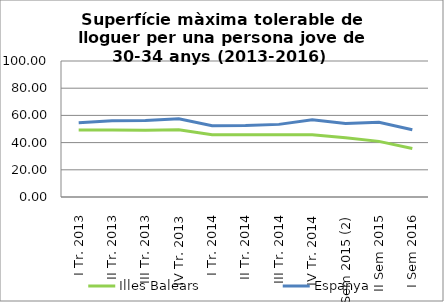
| Category | Illes Balears | Espanya |
|---|---|---|
| I Tr. 2013 | 49.3 | 54.6 |
| II Tr. 2013 | 49.3 | 56 |
| III Tr. 2013 | 49.1 | 56.2 |
| IV Tr. 2013 | 49.4 | 57.6 |
| I Tr. 2014 | 45.8 | 52.4 |
| II Tr. 2014 | 45.7 | 52.5 |
| III Tr. 2014 | 45.8 | 53.4 |
| IV Tr. 2014 | 45.8 | 56.8 |
| I Sem 2015 (2) | 43.5 | 54.1 |
| II Sem 2015 | 40.9 | 54.9 |
| I Sem 2016 | 35.7 | 49.4 |